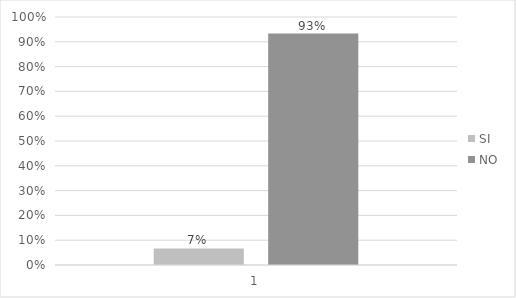
| Category | SI | NO |
|---|---|---|
| 0 | 0.067 | 0.933 |